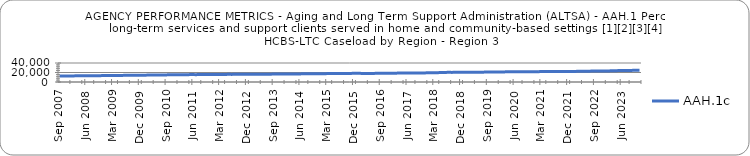
| Category | AAH.1c |
|---|---|
| 0.78378 | 12611 |
| 0.78567 | 12731 |
| 0.78719 | 12706 |
| 0.7887 | 12746 |
| 0.79022 | 12799 |
| 0.79129 | 12886 |
| 0.79193 | 12987 |
| 0.79455 | 13027 |
| 0.79439 | 13111 |
| 0.79457 | 13077 |
| 0.79632 | 13095 |
| 0.79721 | 13207 |
| 0.79865 | 13252 |
| 0.79917 | 13407 |
| 0.79965 | 13417 |
| 0.79991 | 13435 |
| 0.80036 | 13417 |
| 0.80119 | 13526 |
| 0.80135 | 13634 |
| 0.80196 | 13734 |
| 0.80282 | 13813 |
| 0.80375 | 13906 |
| 0.80441 | 14004 |
| 0.80454 | 14140 |
| 0.80574 | 14239 |
| 0.80717 | 14348 |
| 0.80907 | 14348 |
| 0.80996 | 14434 |
| 0.81048 | 14377 |
| 0.81132 | 14444 |
| 0.81235 | 14538 |
| 0.81422 | 14594 |
| 0.81521 | 14756 |
| 0.81511 | 14798 |
| 0.816 | 14868 |
| 0.81562 | 14919 |
| 0.8177 | 14977 |
| 0.81902 | 15082 |
| 0.81999 | 15081 |
| 0.8202 | 15111 |
| 0.82092 | 15205 |
| 0.82336 | 15136 |
| 0.82379 | 15389 |
| 0.82545 | 15437 |
| 0.82578 | 15575 |
| 0.82632 | 15551 |
| 0.82543 | 15481 |
| 0.82484 | 15699 |
| 0.82636 | 15792 |
| 0.82733 | 15935 |
| 0.82838 | 15940 |
| 0.82888 | 16006 |
| 0.82809 | 15821 |
| 0.82917 | 15819 |
| 0.82866 | 15944 |
| 0.82858 | 15970 |
| 0.82802 | 16042 |
| 0.82938 | 16062 |
| 0.83046 | 16038 |
| 0.83086 | 16158 |
| 0.83171 | 16086 |
| 0.83162 | 16227 |
| 0.83156 | 16192 |
| 0.8309 | 16278 |
| 0.83222 | 16334 |
| 0.83276 | 16282 |
| 0.83338 | 16311 |
| 0.83336 | 16321 |
| 0.83239 | 16382 |
| 0.83251 | 16429 |
| 0.8337 | 16496 |
| 0.83426 | 16559 |
| 0.83557 | 16604 |
| 0.83627 | 16720 |
| 0.83614 | 16690 |
| 0.83597 | 16745 |
| 0.83796 | 16793 |
| 0.83821 | 16788 |
| 0.83855 | 16961 |
| 0.84014 | 17004 |
| 0.83995 | 17090 |
| 0.84007 | 17065 |
| 0.8402 | 17254 |
| 0.841 | 17285 |
| 0.8424 | 17379 |
| 0.8431 | 17482 |
| 0.8435 | 17467 |
| 0.8439 | 17584 |
| 0.84383 | 17477 |
| 0.84463 | 17481 |
| 0.84443 | 17670 |
| 0.84487 | 17850 |
| 0.84543 | 17920 |
| 0.8466 | 17996 |
| 0.84682 | 17988 |
| 0.84816 | 18045 |
| 0.84589 | 18074 |
| 0.84646 | 18156 |
| 0.84772 | 18137 |
| 0.8486 | 18200 |
| 0.84786 | 18180 |
| 0.84849 | 18272 |
| 0.84851 | 17824 |
| 0.8492 | 17949 |
| 0.84852 | 18024 |
| 0.84989 | 18143 |
| 0.85076 | 18156 |
| 0.85196 | 18315 |
| 0.8534 | 18403 |
| 0.85355 | 18453 |
| 0.85326 | 18522 |
| 0.85294 | 18511 |
| 0.85119 | 18521 |
| 0.85152 | 18585 |
| 0.85143 | 18801 |
| 0.85182 | 18808 |
| 0.8521 | 18851 |
| 0.85264 | 18930 |
| 0.85441 | 18905 |
| 0.85526 | 19034 |
| 0.85728 | 19041 |
| 0.8577 | 19166 |
| 0.85845 | 19150 |
| 0.85828 | 19186 |
| 0.85799 | 19289 |
| 0.85772 | 19331 |
| 0.85887 | 19589 |
| 0.86116 | 19612 |
| 0.86123 | 19863 |
| 0.86193 | 19889 |
| 0.86372 | 20234 |
| 0.86147 | 20371 |
| 0.86303 | 20220 |
| 0.86431 | 20502 |
| 0.86533 | 20407 |
| 0.86473 | 20567 |
| 0.86411 | 20647 |
| 0.86504 | 20311 |
| 0.86518 | 20527 |
| 0.86641 | 20655 |
| 0.86717 | 20658 |
| 0.86792 | 20602 |
| 0.8694 | 20688 |
| 0.86921 | 20824 |
| 0.87375 | 20893 |
| 0.87927 | 21039 |
| 0.88196 | 20859 |
| 0.8826 | 20981 |
| 0.88378 | 20982 |
| 0.88511 | 21039 |
| 0.8857 | 21394 |
| 0.88923 | 21568 |
| 0.89424 | 21559 |
| 0.89466 | 21684 |
| 0.89512 | 21609 |
| 0.89475 | 21610 |
| 0.89525 | 21618 |
| 0.89485 | 21738 |
| 0.89346 | 21698 |
| 0.89386 | 21751 |
| 0.89048 | 21632 |
| 0.89013 | 21741 |
| 0.89185 | 22037 |
| 0.8934 | 22067 |
| 0.89298 | 21993 |
| 0.89372 | 22107 |
| 0.89661 | 22094 |
| 0.89824 | 22091 |
| 0.89708 | 22038 |
| 0.89662 | 22063 |
| 0.89759 | 21899 |
| 0.89814 | 21972 |
| 0.89823 | 21966 |
| 0.89819 | 22144 |
| 0.89789 | 22433 |
| 0.89829 | 22566 |
| 0.89874 | 22716 |
| 0.90061 | 22782 |
| 0.90125 | 22806 |
| 0.90115 | 22961 |
| 0.90196 | 22951 |
| 0.90133 | 23010 |
| 0.90135 | 23051 |
| 0.90118 | 23182 |
| 0.90219 | 23353 |
| 0.90296 | 23400 |
| 0.90356 | 23784 |
| 0.90607 | 23765 |
| 0.90755 | 24072 |
| 0.91023 | 24053 |
| nan | 24115 |
| nan | 24293 |
| nan | 24288 |
| nan | 24606 |
| nan | 24554 |
| nan | 24611 |